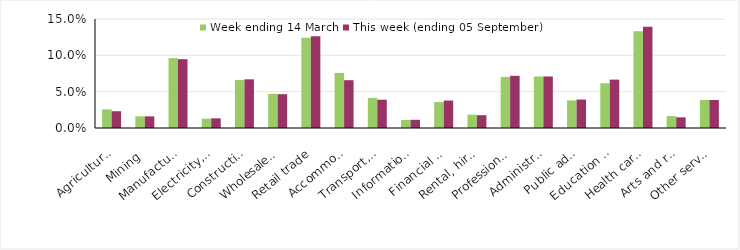
| Category | Week ending 14 March | This week (ending 05 September) |
|---|---|---|
| Agriculture, forestry and fishing | 0.026 | 0.023 |
| Mining | 0.016 | 0.016 |
| Manufacturing | 0.096 | 0.095 |
| Electricity, gas, water and waste services | 0.013 | 0.013 |
| Construction | 0.066 | 0.067 |
| Wholesale trade | 0.047 | 0.046 |
| Retail trade | 0.124 | 0.126 |
| Accommodation and food services | 0.076 | 0.066 |
| Transport, postal and warehousing | 0.041 | 0.039 |
| Information media and telecommunications | 0.011 | 0.011 |
| Financial and insurance services | 0.036 | 0.038 |
| Rental, hiring and real estate services | 0.018 | 0.018 |
| Professional, scientific and technical services | 0.07 | 0.072 |
| Administrative and support services | 0.071 | 0.071 |
| Public administration and safety | 0.038 | 0.039 |
| Education and training | 0.062 | 0.067 |
| Health care and social assistance | 0.133 | 0.14 |
| Arts and recreation services | 0.016 | 0.015 |
| Other services | 0.038 | 0.038 |